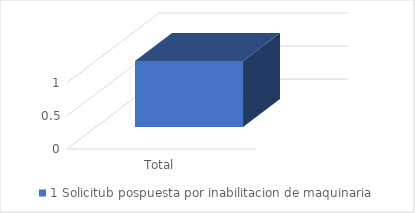
| Category | 1 |
|---|---|
| Total | 1 |